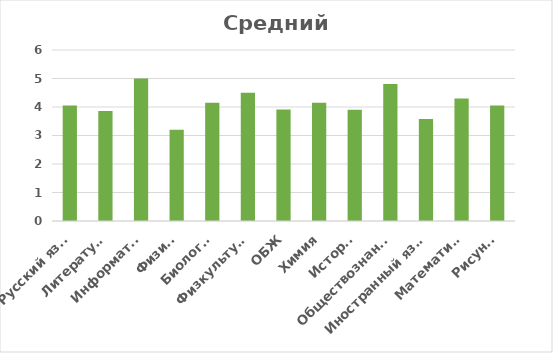
| Category | Средний балл |
|---|---|
| Русский язык  | 4.05 |
| Литература | 3.86 |
| Информатка | 5 |
| Физика | 3.2 |
| Биология | 4.15 |
| Физкультура | 4.5 |
| ОБЖ | 3.91 |
| Химия | 4.15 |
| История | 3.9 |
| Обществознание | 4.81 |
| Иностранный язык | 3.58 |
| Математика | 4.3 |
| Рисунок | 4.05 |